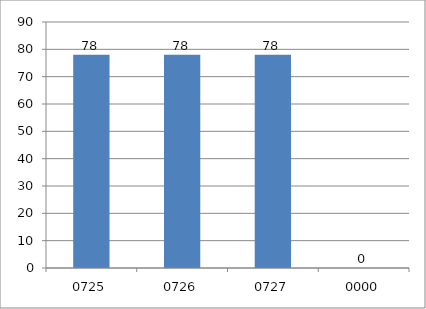
| Category | Series 0 |
|---|---|
| 725.0 | 78 |
| 726.0 | 78 |
| 727.0 | 78 |
| 0.0 | 0 |